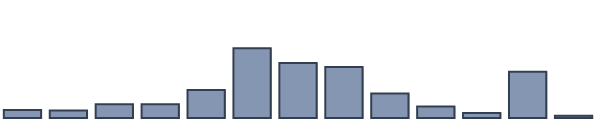
| Category | Series 0 |
|---|---|
| 0 | 2.4 |
| 1 | 2.2 |
| 2 | 4.1 |
| 3 | 4.1 |
| 4 | 8.3 |
| 5 | 20.7 |
| 6 | 16.3 |
| 7 | 15.1 |
| 8 | 7.3 |
| 9 | 3.4 |
| 10 | 1.5 |
| 11 | 13.7 |
| 12 | 0.7 |